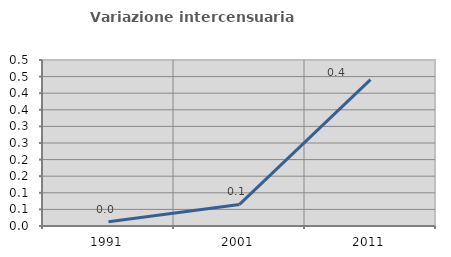
| Category | Variazione intercensuaria annua |
|---|---|
| 1991.0 | 0.013 |
| 2001.0 | 0.065 |
| 2011.0 | 0.441 |